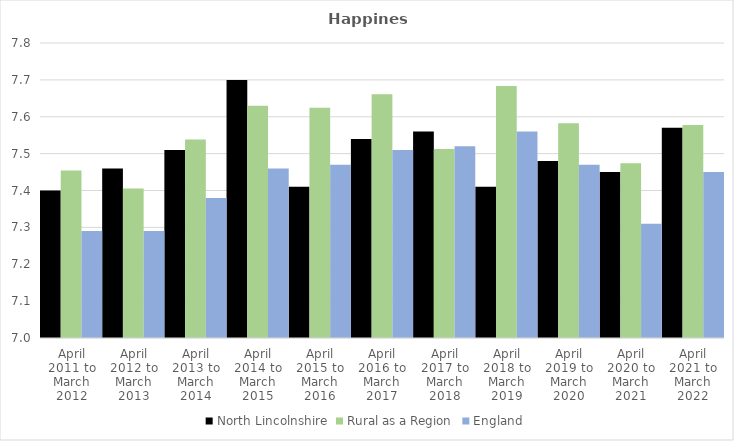
| Category | North Lincolnshire | Rural as a Region | England |
|---|---|---|---|
| April 2011 to March 2012 | 7.4 | 7.454 | 7.29 |
| April 2012 to March 2013 | 7.46 | 7.406 | 7.29 |
| April 2013 to March 2014 | 7.51 | 7.539 | 7.38 |
| April 2014 to March 2015 | 7.7 | 7.63 | 7.46 |
| April 2015 to March 2016 | 7.41 | 7.625 | 7.47 |
| April 2016 to March 2017 | 7.54 | 7.661 | 7.51 |
| April 2017 to March 2018 | 7.56 | 7.513 | 7.52 |
| April 2018 to March 2019 | 7.41 | 7.684 | 7.56 |
| April 2019 to March 2020 | 7.48 | 7.582 | 7.47 |
| April 2020 to March 2021 | 7.45 | 7.474 | 7.31 |
| April 2021 to March 2022 | 7.57 | 7.577 | 7.45 |